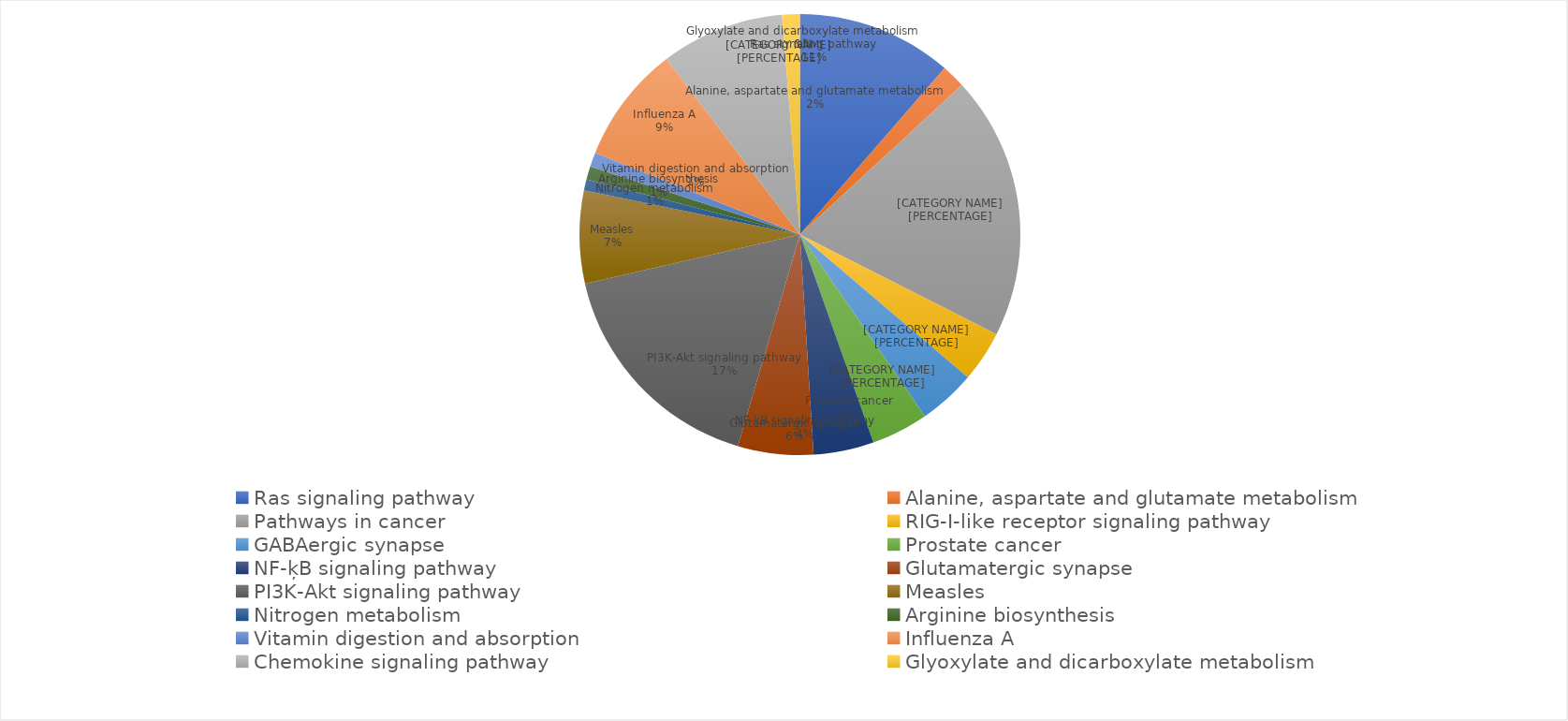
| Category | Total |
|---|---|
| Ras signaling pathway | 237 |
| Alanine, aspartate and glutamate metabolism | 36 |
| Pathways in cancer | 402 |
| RIG-I-like receptor signaling pathway | 78 |
| GABAergic synapse | 87 |
| Prostate cancer | 87 |
| NF-ķB signaling pathway | 92 |
| Glutamatergic synapse | 115 |
| PI3K-Akt signaling pathway | 351 |
| Measles | 141 |
| Nitrogen metabolism | 17 |
| Arginine biosynthesis | 20 |
| Vitamin digestion and absorption | 22 |
| Influenza A | 179 |
| Chemokine signaling pathway | 188 |
| Glyoxylate and dicarboxylate metabolism | 27 |